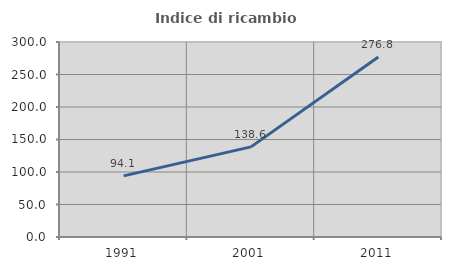
| Category | Indice di ricambio occupazionale  |
|---|---|
| 1991.0 | 94.059 |
| 2001.0 | 138.624 |
| 2011.0 | 276.846 |